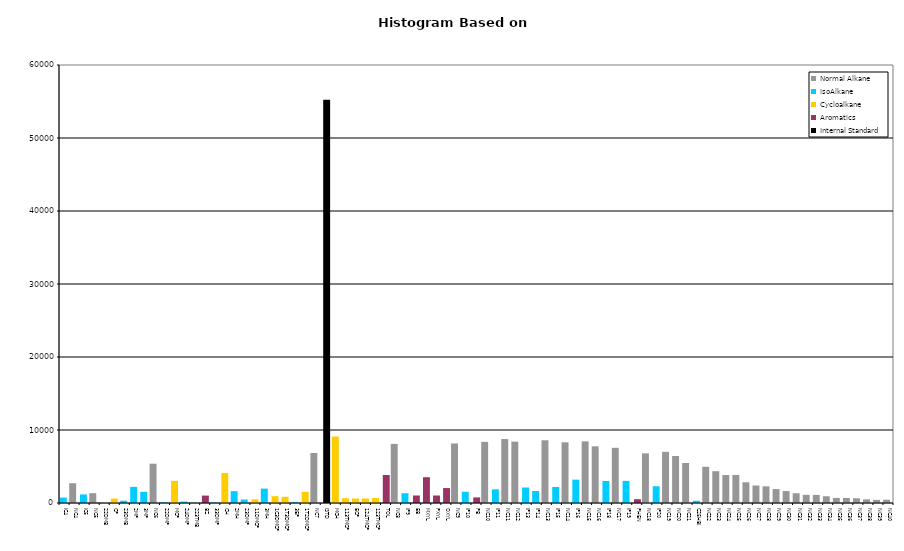
| Category | Normal Alkane | IsoAlkane | Cycloalkane | Aromatics | Internal Standard |
|---|---|---|---|---|---|
| IC4 | 0 | 740 | 0 | 0 | 0 |
| NC4 | 2709 | 0 | 0 | 0 | 0 |
| IC5 | 0 | 1174 | 0 | 0 | 0 |
| NC5 | 1349 | 0 | 0 | 0 | 0 |
| 22DMB | 0 | 0 | 0 | 0 | 0 |
| CP | 0 | 0 | 614 | 0 | 0 |
| 23DMB | 0 | 311 | 0 | 0 | 0 |
| 2MP | 0 | 2205 | 0 | 0 | 0 |
| 3MP | 0 | 1533 | 0 | 0 | 0 |
| NC6 | 5385 | 0 | 0 | 0 | 0 |
| 22DMP | 0 | 90 | 0 | 0 | 0 |
| MCP | 0 | 0 | 3024 | 0 | 0 |
| 24DMP | 0 | 195 | 0 | 0 | 0 |
| 223TMB | 0 | 32 | 0 | 0 | 0 |
| BZ | 0 | 0 | 0 | 1017 | 0 |
| 33DMP | 0 | 85 | 0 | 0 | 0 |
| CH | 0 | 0 | 4115 | 0 | 0 |
| 2MH | 0 | 1627 | 0 | 0 | 0 |
| 23DMP | 0 | 478 | 0 | 0 | 0 |
| 11DMCP | 0 | 0 | 501 | 0 | 0 |
| 3MH | 0 | 1972 | 0 | 0 | 0 |
| 1C3DMCP | 0 | 0 | 938 | 0 | 0 |
| 1T3DMCP | 0 | 0 | 849 | 0 | 0 |
| 3EP | 0 | 109 | 0 | 0 | 0 |
| 1T2DMCP | 0 | 0 | 1531 | 0 | 0 |
| NC7 | 6850 | 0 | 0 | 0 | 0 |
| ISTD | 0 | 0 | 0 | 0 | 55242 |
| MCH | 0 | 0 | 9104 | 0 | 0 |
| 113TMCP | 0 | 0 | 661 | 0 | 0 |
| ECP | 0 | 0 | 616 | 0 | 0 |
| 124TMCP | 0 | 0 | 621 | 0 | 0 |
| 123TMCP | 0 | 0 | 683 | 0 | 0 |
| TOL | 0 | 0 | 0 | 3837 | 0 |
| NC8 | 8097 | 0 | 0 | 0 | 0 |
| IP9 | 0 | 1337 | 0 | 0 | 0 |
| EB | 0 | 0 | 0 | 1028 | 0 |
| MXYL | 0 | 0 | 0 | 3532 | 0 |
| PXYL | 0 | 0 | 0 | 1027 | 0 |
| OXYL | 0 | 0 | 0 | 2046 | 0 |
| NC9 | 8156 | 0 | 0 | 0 | 0 |
| IP10 | 0 | 1544 | 0 | 0 | 0 |
| PB | 0 | 0 | 0 | 769 | 0 |
| NC10 | 8372 | 0 | 0 | 0 | 0 |
| IP11 | 0 | 1872 | 0 | 0 | 0 |
| NC11 | 8761 | 0 | 0 | 0 | 0 |
| NC12 | 8407 | 0 | 0 | 0 | 0 |
| IP13 | 0 | 2122 | 0 | 0 | 0 |
| IP14 | 0 | 1649 | 0 | 0 | 0 |
| NC13 | 8595 | 0 | 0 | 0 | 0 |
| IP15 | 0 | 2198 | 0 | 0 | 0 |
| NC14 | 8315 | 0 | 0 | 0 | 0 |
| IP16 | 0 | 3200 | 0 | 0 | 0 |
| NC15 | 8445 | 0 | 0 | 0 | 0 |
| NC16 | 7761 | 0 | 0 | 0 | 0 |
| IP18 | 0 | 3012 | 0 | 0 | 0 |
| NC17 | 7559 | 0 | 0 | 0 | 0 |
| IP19 | 0 | 3032 | 0 | 0 | 0 |
| PHEN | 0 | 0 | 0 | 528 | 0 |
| NC18 | 6800 | 0 | 0 | 0 | 0 |
| IP20 | 0 | 2290 | 0 | 0 | 0 |
| NC19 | 7014 | 0 | 0 | 0 | 0 |
| NC20 | 6437 | 0 | 0 | 0 | 0 |
| NC21 | 5481 | 0 | 0 | 0 | 0 |
| C25HBI | 0 | 309 | 0 | 0 | 0 |
| NC22 | 4961 | 0 | 0 | 0 | 0 |
| NC23 | 4355 | 0 | 0 | 0 | 0 |
| NC24 | 3830 | 0 | 0 | 0 | 0 |
| NC25 | 3839 | 0 | 0 | 0 | 0 |
| NC26 | 2842 | 0 | 0 | 0 | 0 |
| NC27 | 2396 | 0 | 0 | 0 | 0 |
| NC28 | 2280 | 0 | 0 | 0 | 0 |
| NC29 | 1909 | 0 | 0 | 0 | 0 |
| NC30 | 1635 | 0 | 0 | 0 | 0 |
| NC31 | 1334 | 0 | 0 | 0 | 0 |
| NC32 | 1116 | 0 | 0 | 0 | 0 |
| NC33 | 1110 | 0 | 0 | 0 | 0 |
| NC34 | 922 | 0 | 0 | 0 | 0 |
| NC35 | 695 | 0 | 0 | 0 | 0 |
| NC36 | 690 | 0 | 0 | 0 | 0 |
| NC37 | 650 | 0 | 0 | 0 | 0 |
| NC38 | 501 | 0 | 0 | 0 | 0 |
| NC39 | 426 | 0 | 0 | 0 | 0 |
| NC40 | 448 | 0 | 0 | 0 | 0 |